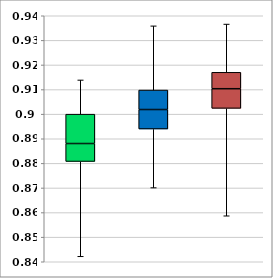
| Category | Series 0 | Series 1 | Series 2 | Series 3 |
|---|---|---|---|---|
| 0 | 0.842 | 0.039 | 0.007 | 0.012 |
| 1 | 0.87 | 0.024 | 0.008 | 0.008 |
| 2 | 0.859 | 0.044 | 0.008 | 0.007 |